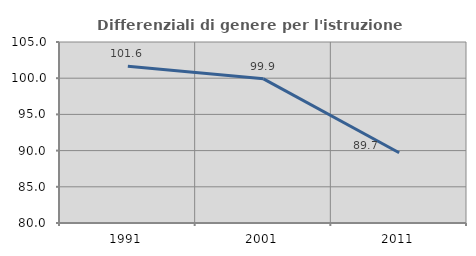
| Category | Differenziali di genere per l'istruzione superiore |
|---|---|
| 1991.0 | 101.636 |
| 2001.0 | 99.916 |
| 2011.0 | 89.708 |